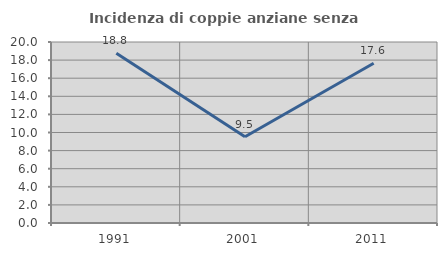
| Category | Incidenza di coppie anziane senza figli  |
|---|---|
| 1991.0 | 18.75 |
| 2001.0 | 9.524 |
| 2011.0 | 17.647 |